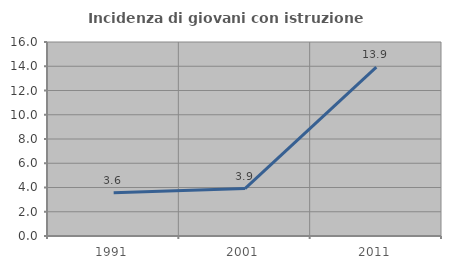
| Category | Incidenza di giovani con istruzione universitaria |
|---|---|
| 1991.0 | 3.562 |
| 2001.0 | 3.911 |
| 2011.0 | 13.92 |